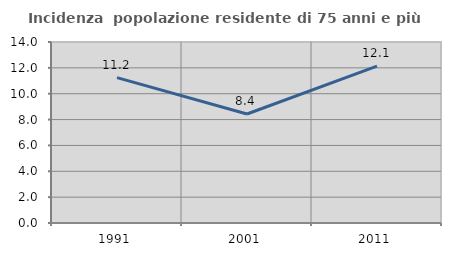
| Category | Incidenza  popolazione residente di 75 anni e più |
|---|---|
| 1991.0 | 11.248 |
| 2001.0 | 8.431 |
| 2011.0 | 12.133 |